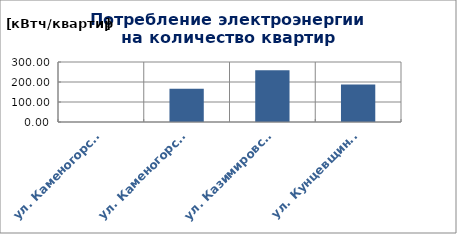
| Category | Series 0 |
|---|---|
| ул. Каменогорская, 30 | 0 |
| ул. Каменогорская, 86 | 165.671 |
| ул. Казимировская, 9 | 259.068 |
| ул. Кунцевщина, 35 | 187.553 |